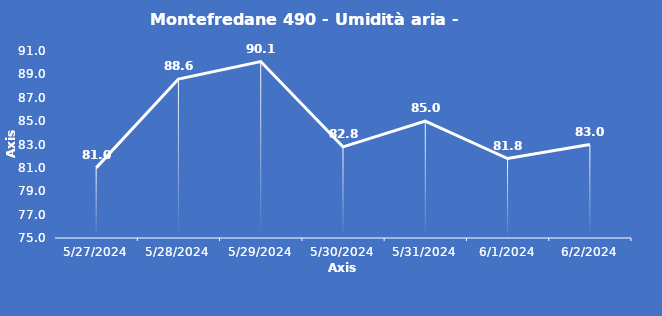
| Category | Montefredane 490 - Umidità aria - Grezzo (%) |
|---|---|
| 5/27/24 | 81 |
| 5/28/24 | 88.6 |
| 5/29/24 | 90.1 |
| 5/30/24 | 82.8 |
| 5/31/24 | 85 |
| 6/1/24 | 81.8 |
| 6/2/24 | 83 |